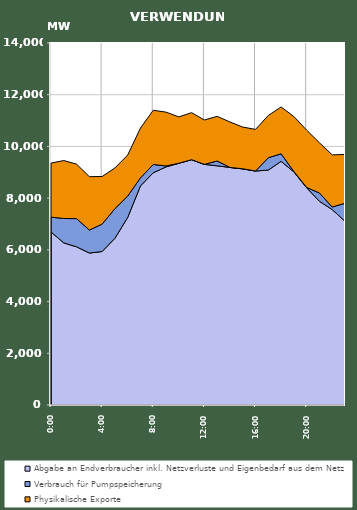
| Category | Abgabe an Endverbraucher inkl. Netzverluste und Eigenbedarf aus dem Netz | Verbrauch für Pumpspeicherung | Physikalische Exporte |
|---|---|---|---|
| 2007-01-17 | 6692.161 | 573.539 | 2089.621 |
| 2007-01-17 01:00:00 | 6268.455 | 943.799 | 2242.07 |
| 2007-01-17 02:00:00 | 6116.822 | 1090.621 | 2107.29 |
| 2007-01-17 03:00:00 | 5876.264 | 889.926 | 2064.7 |
| 2007-01-17 04:00:00 | 5935.776 | 1058.433 | 1842.053 |
| 2007-01-17 05:00:00 | 6446.684 | 1147.484 | 1572.973 |
| 2007-01-17 06:00:00 | 7254.341 | 826.883 | 1587.223 |
| 2007-01-17 07:00:00 | 8472.532 | 311.298 | 1927.354 |
| 2007-01-17 08:00:00 | 8981.57 | 319.856 | 2096.697 |
| 2007-01-17 09:00:00 | 9206.91 | 37.887 | 2081.307 |
| 2007-01-17 10:00:00 | 9348.857 | 0.695 | 1792.909 |
| 2007-01-17 11:00:00 | 9487.094 | 1.124 | 1817.708 |
| 2007-01-17 12:00:00 | 9305.892 | 1.06 | 1716.015 |
| 2007-01-17 13:00:00 | 9249.616 | 186.803 | 1726.699 |
| 2007-01-17 14:00:00 | 9187.5 | 0.807 | 1757.203 |
| 2007-01-17 15:00:00 | 9131.559 | 4.174 | 1612.825 |
| 2007-01-17 16:00:00 | 9048.555 | 0.203 | 1609.934 |
| 2007-01-17 17:00:00 | 9085.468 | 475.825 | 1636.944 |
| 2007-01-17 18:00:00 | 9422.871 | 292.285 | 1812.099 |
| 2007-01-17 19:00:00 | 9017.015 | 16.268 | 2122.925 |
| 2007-01-17 20:00:00 | 8402.348 | 10.692 | 2217.101 |
| 2007-01-17 21:00:00 | 7878.627 | 320.509 | 1942.236 |
| 2007-01-17 22:00:00 | 7557.845 | 100.208 | 2015.18 |
| 2007-01-17 23:00:00 | 7104.324 | 696.937 | 1888.313 |